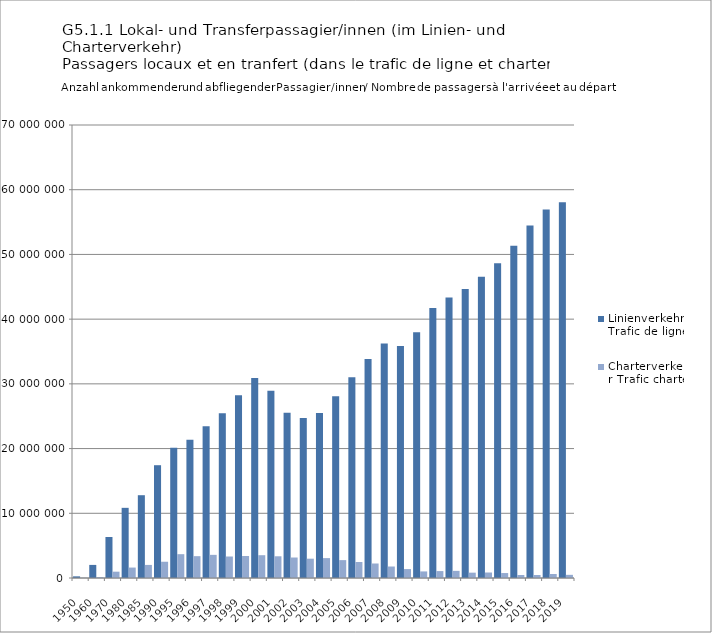
| Category | Linienverkehr Trafic de ligne | Charterverkehr Trafic charter |
|---|---|---|
| 1950.0 | 253841 | 41022 |
| 1960.0 | 2023236 | 137323 |
| 1970.0 | 6337115 | 976936 |
| 1980.0 | 10841892 | 1613283 |
| 1985.0 | 12793091 | 2020245 |
| 1990.0 | 17429429 | 2512970 |
| 1995.0 | 20125817 | 3681340 |
| 1996.0 | 21357627 | 3373923 |
| 1997.0 | 23441048 | 3576564 |
| 1998.0 | 25458347 | 3322957 |
| 1999.0 | 28247600 | 3398247 |
| 2000.0 | 30903947 | 3522854 |
| 2001.0 | 28935233 | 3356535 |
| 2002.0 | 25550674 | 3166327 |
| 2003.0 | 24738668 | 2984620 |
| 2004.0 | 25496561 | 3074237 |
| 2005.0 | 28096814 | 2763237 |
| 2006.0 | 31017882 | 2470001 |
| 2007.0 | 33826265 | 2240899 |
| 2008.0 | 36221048 | 1774796 |
| 2009.0 | 35853037 | 1381990 |
| 2010.0 | 37991700 | 1017346 |
| 2011.0 | 41704038 | 1069301 |
| 2012.0 | 43341576 | 1102634 |
| 2013.0 | 44675890 | 825643 |
| 2014.0 | 46558454 | 847977 |
| 2015.0 | 48626319 | 766381 |
| 2016.0 | 51334271 | 466259 |
| 2017.0 | 54451314 | 460591 |
| 2018.0 | 56940045 | 614750 |
| 2019.0 | 58072914 | 489005 |